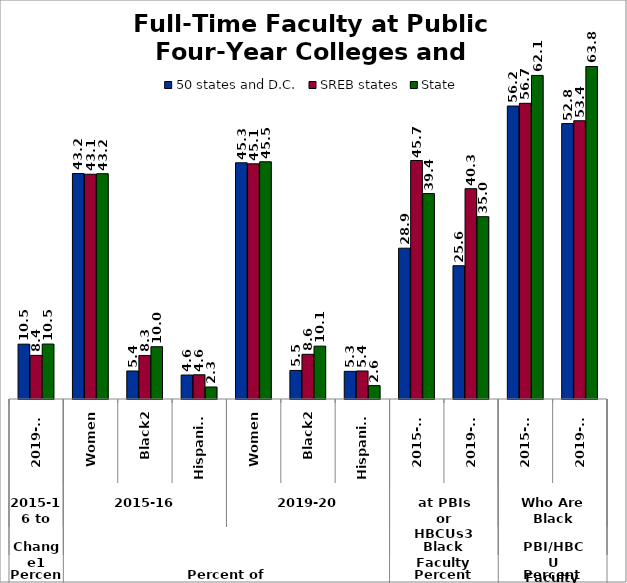
| Category | 50 states and D.C. | SREB states | State |
|---|---|---|---|
| 0 | 10.517 | 8.366 | 10.538 |
| 1 | 43.247 | 43.109 | 43.205 |
| 2 | 5.37 | 8.344 | 10.025 |
| 3 | 4.595 | 4.649 | 2.302 |
| 4 | 45.299 | 45.106 | 45.496 |
| 5 | 5.483 | 8.571 | 10.133 |
| 6 | 5.305 | 5.371 | 2.565 |
| 7 | 28.92 | 45.739 | 39.398 |
| 8 | 25.561 | 40.336 | 34.96 |
| 9 | 56.182 | 56.707 | 62.055 |
| 10 | 52.829 | 53.365 | 63.768 |